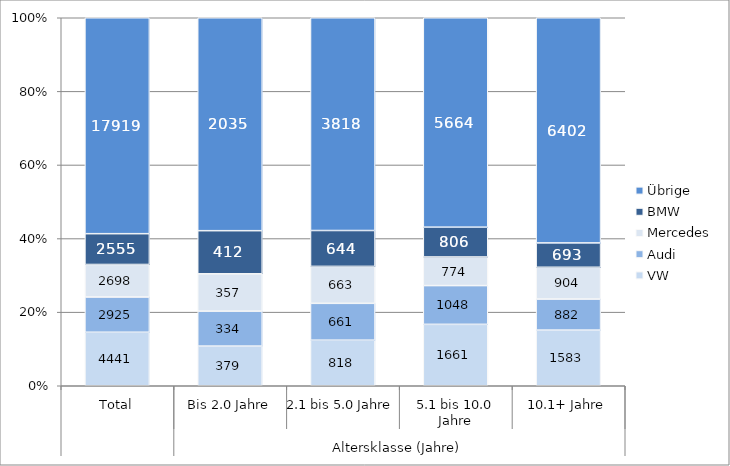
| Category | VW | Audi | Mercedes | BMW | Übrige |
|---|---|---|---|---|---|
| 0 | 4441 | 2925 | 2698 | 2555 | 17919 |
| 1 | 379 | 334 | 357 | 412 | 2035 |
| 2 | 818 | 661 | 663 | 644 | 3818 |
| 3 | 1661 | 1048 | 774 | 806 | 5664 |
| 4 | 1583 | 882 | 904 | 693 | 6402 |